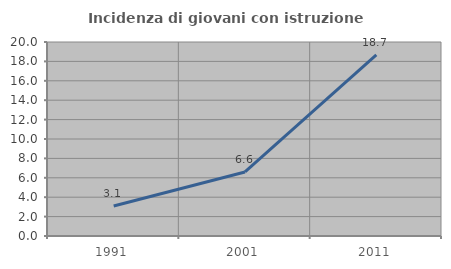
| Category | Incidenza di giovani con istruzione universitaria |
|---|---|
| 1991.0 | 3.093 |
| 2001.0 | 6.604 |
| 2011.0 | 18.667 |